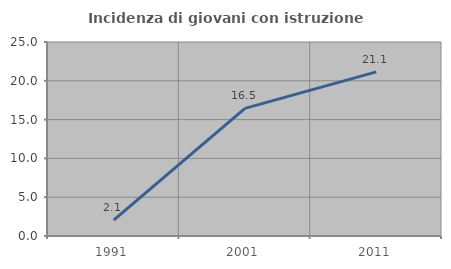
| Category | Incidenza di giovani con istruzione universitaria |
|---|---|
| 1991.0 | 2.054 |
| 2001.0 | 16.452 |
| 2011.0 | 21.148 |